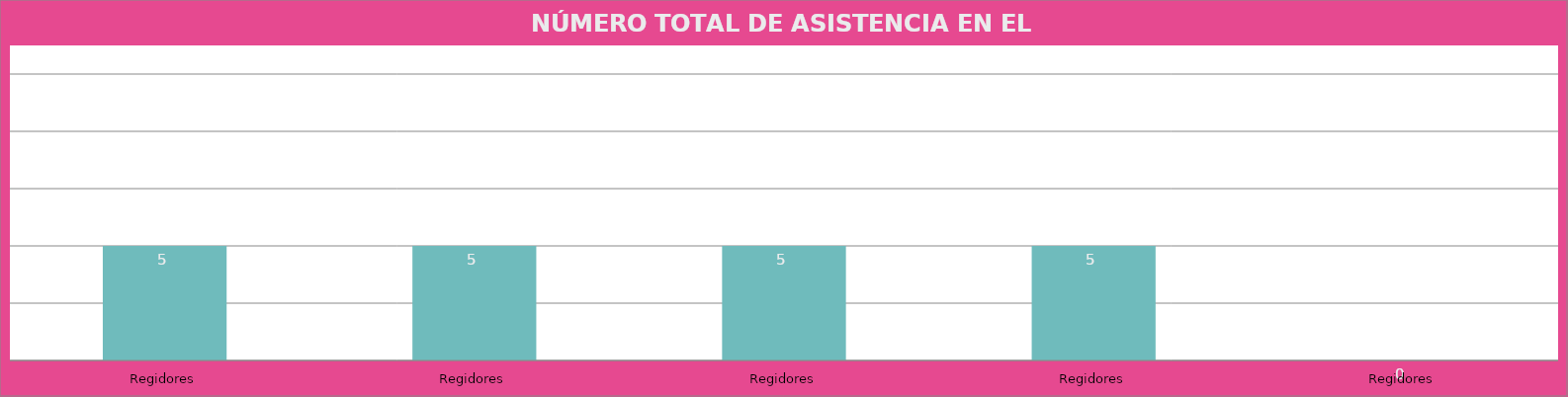
| Category | Regidores |
|---|---|
| Regidores | 5 |
| Regidores | 5 |
| Regidores | 5 |
| Regidores | 5 |
| Regidores | 0 |